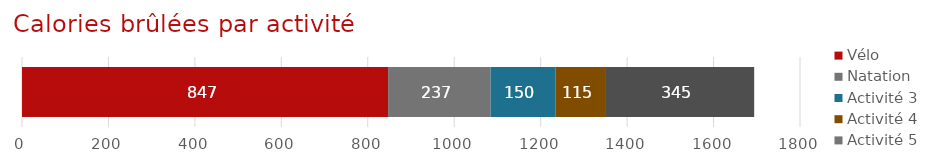
| Category | Vélo | Natation | Activité 3 | Activité 4 | Activité 5 |
|---|---|---|---|---|---|
| Suivi des activités | 847 | 237 | 150 | 115 | 345 |